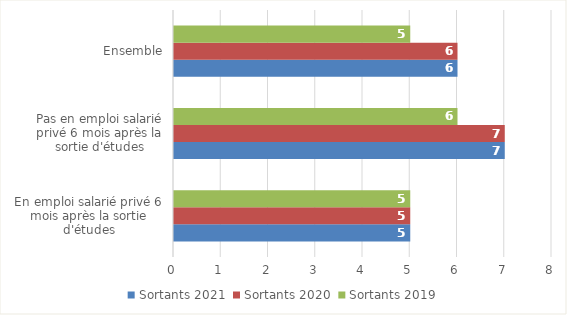
| Category | Sortants 2021 | Sortants 2020 | Sortants 2019 |
|---|---|---|---|
| En emploi salarié privé 6 mois après la sortie d'études | 5 | 5 | 5 |
| Pas en emploi salarié privé 6 mois après la sortie d'études | 7 | 7 | 6 |
| Ensemble | 6 | 6 | 5 |